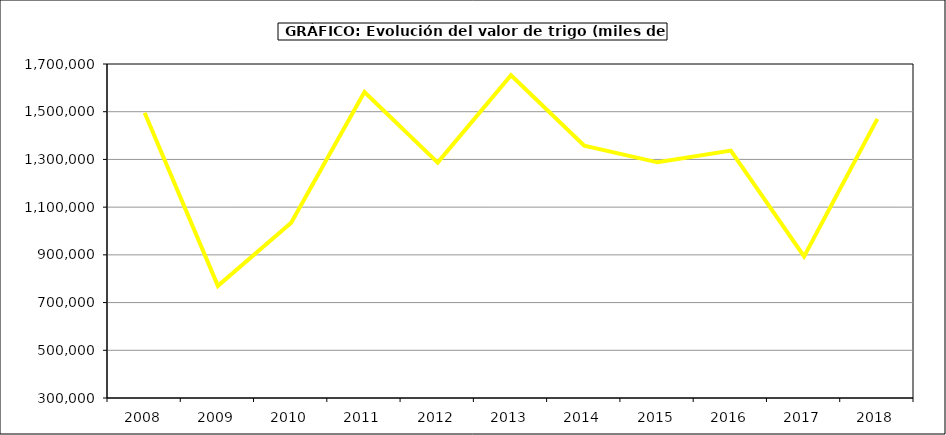
| Category | Valor |
|---|---|
| 2008.0 | 1495406.813 |
| 2009.0 | 770204.952 |
| 2010.0 | 1034362.398 |
| 2011.0 | 1582317.395 |
| 2012.0 | 1286558.361 |
| 2013.0 | 1652767.635 |
| 2014.0 | 1357332.32 |
| 2015.0 | 1287809 |
| 2016.0 | 1336858 |
| 2017.0 | 893127.676 |
| 2018.0 | 1470167.37 |